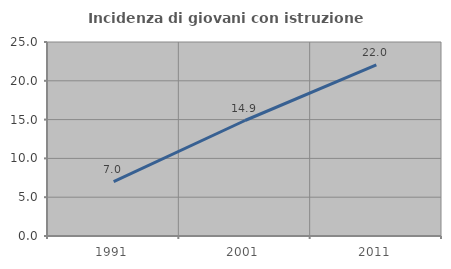
| Category | Incidenza di giovani con istruzione universitaria |
|---|---|
| 1991.0 | 7.006 |
| 2001.0 | 14.884 |
| 2011.0 | 22.047 |